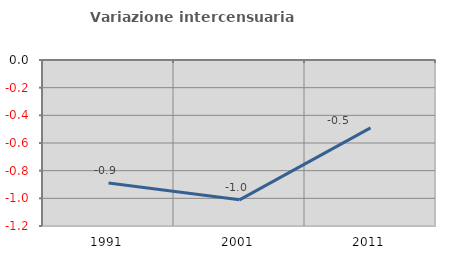
| Category | Variazione intercensuaria annua |
|---|---|
| 1991.0 | -0.89 |
| 2001.0 | -1.011 |
| 2011.0 | -0.49 |